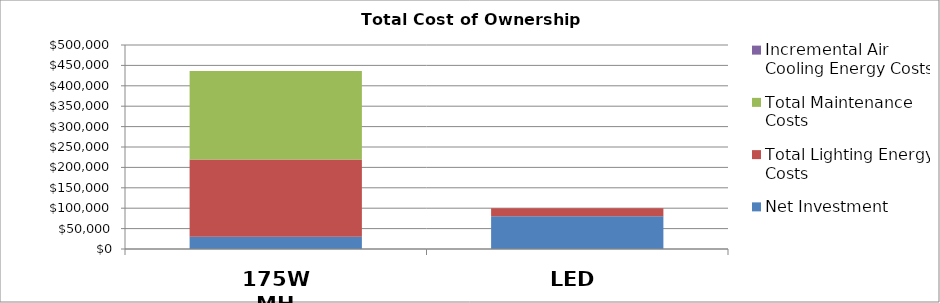
| Category | Net Investment | Total Lighting Energy Costs | Total Maintenance Costs | Incremental Air Cooling Energy Costs |
|---|---|---|---|---|
| 175W MH | 30000 | 189331.085 | 216987.84 | 0 |
| LED | 80500 | 19115.158 | 0 | 0 |